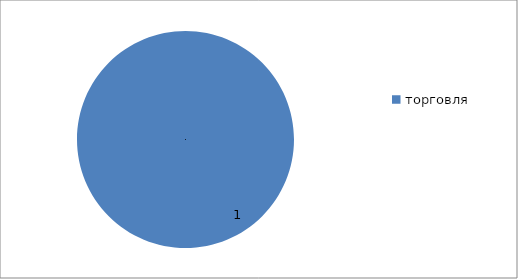
| Category | торговля |
|---|---|
| торговля | 1 |